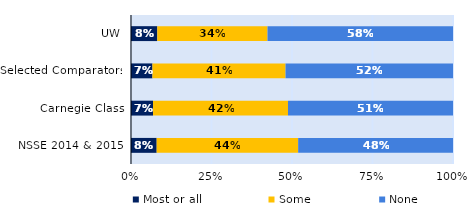
| Category | Most or all | Some | None |
|---|---|---|---|
| UW | 0.082 | 0.342 | 0.576 |
| Selected Comparators | 0.067 | 0.413 | 0.52 |
| Carnegie Class | 0.068 | 0.419 | 0.512 |
| NSSE 2014 & 2015 | 0.08 | 0.439 | 0.481 |